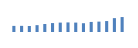
| Category | Exportações (1) |
|---|---|
| 0 | 203692.629 |
| 1 | 204985.899 |
| 2 | 199789.293 |
| 3 | 228223.553 |
| 4 | 265930.688 |
| 5 | 297441.741 |
| 6 | 313195.508 |
| 7 | 319331.634 |
| 8 | 313646.514 |
| 9 | 292708.824 |
| 10 | 335676.548 |
| 11 | 346139.442 |
| 12 | 364472.386 |
| 13 | 462235.534 |
| 14 | 497984.021 |